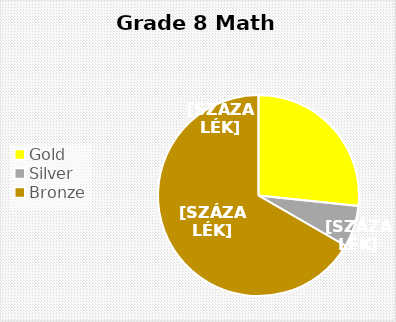
| Category | Series 0 |
|---|---|
| Gold | 4 |
| Silver | 1 |
| Bronze  | 10 |